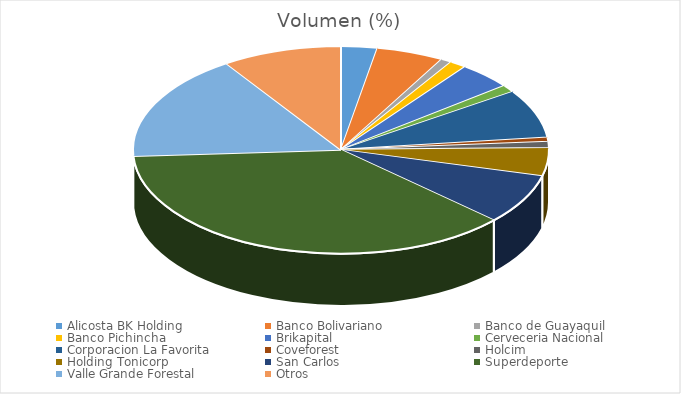
| Category | Volumen |
|---|---|
| Alicosta BK Holding | 196596 |
| Banco Bolivariano | 366000 |
| Banco de Guayaquil | 57809.87 |
| Banco Pichincha | 90290 |
| Brikapital | 292000 |
| Cerveceria Nacional | 78055.5 |
| Corporacion La Favorita | 527239.39 |
| Coveforest | 45029.4 |
| Holcim | 68583 |
| Holding Tonicorp | 303182.4 |
| San Carlos | 542230.55 |
| Superdeporte | 2590121.53 |
| Valle Grande Forestal | 1156734.8 |
| Otros | 648314 |